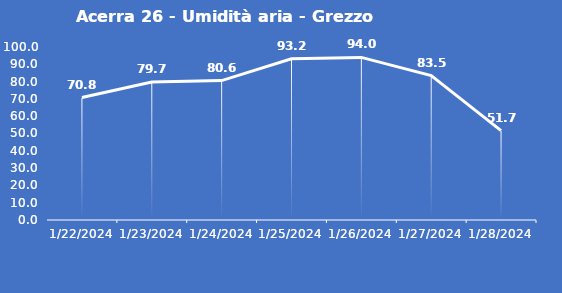
| Category | Acerra 26 - Umidità aria - Grezzo (%) |
|---|---|
| 1/22/24 | 70.8 |
| 1/23/24 | 79.7 |
| 1/24/24 | 80.6 |
| 1/25/24 | 93.2 |
| 1/26/24 | 94 |
| 1/27/24 | 83.5 |
| 1/28/24 | 51.7 |